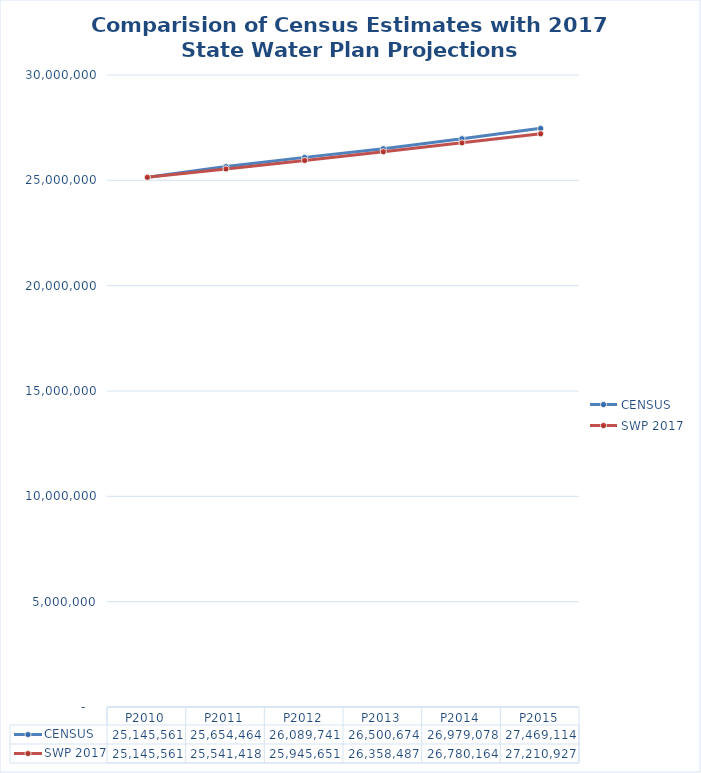
| Category | CENSUS | SWP 2017 |
|---|---|---|
| P2010 | 25145561 | 25145561 |
| P2011 | 25654464 | 25541418.424 |
| P2012 | 26089741 | 25945650.635 |
| P2013 | 26500674 | 26358486.902 |
| P2014 | 26979078 | 26780164.094 |
| P2015 | 27469114 | 27210926.972 |